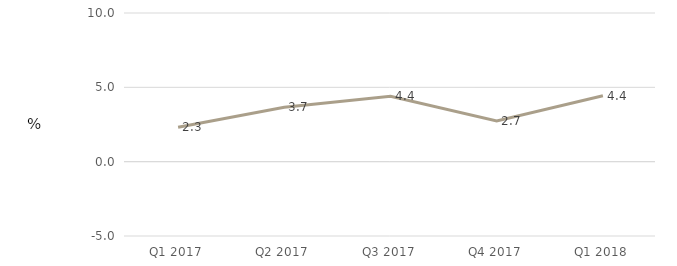
| Category | Financial companies |
|---|---|
| Q1 2017 | 2.313 |
| Q2 2017 | 3.659 |
| Q3 2017 | 4.402 |
| Q4 2017 | 2.745 |
| Q1 2018 | 4.431 |